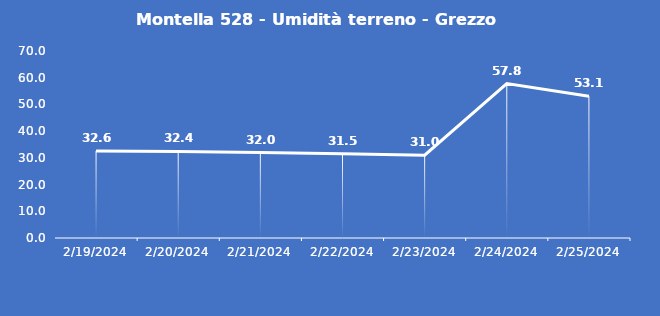
| Category | Montella 528 - Umidità terreno - Grezzo (%VWC) |
|---|---|
| 2/19/24 | 32.6 |
| 2/20/24 | 32.4 |
| 2/21/24 | 32 |
| 2/22/24 | 31.5 |
| 2/23/24 | 31 |
| 2/24/24 | 57.8 |
| 2/25/24 | 53.1 |